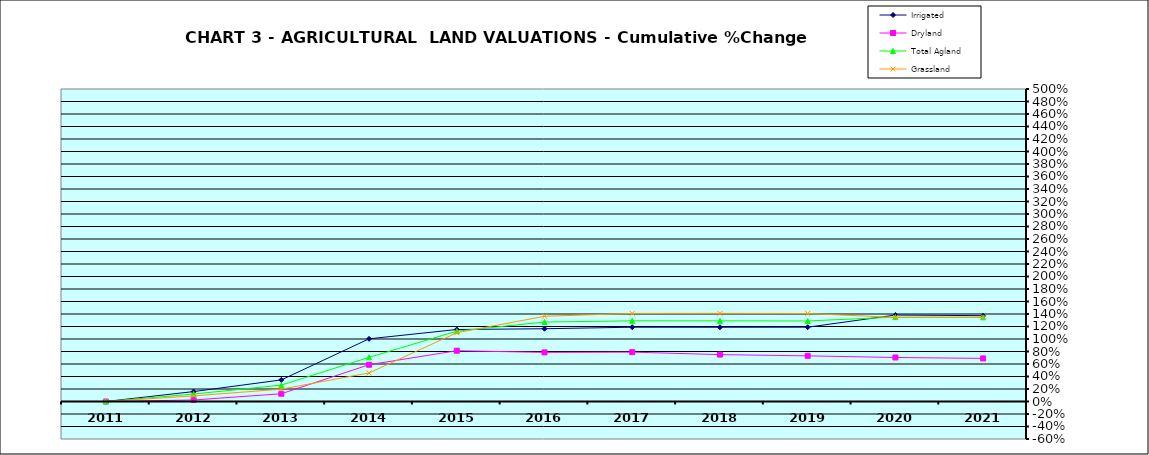
| Category | Irrigated | Dryland | Total Agland | Grassland |
|---|---|---|---|---|
| 2011.0 | 0 | 0 | 0 | 0 |
| 2012.0 | 0.159 | 0.024 | 0.119 | 0.09 |
| 2013.0 | 0.345 | 0.124 | 0.262 | 0.198 |
| 2014.0 | 1.003 | 0.588 | 0.706 | 0.457 |
| 2015.0 | 1.152 | 0.812 | 1.125 | 1.1 |
| 2016.0 | 1.164 | 0.786 | 1.271 | 1.363 |
| 2017.0 | 1.189 | 0.79 | 1.291 | 1.409 |
| 2018.0 | 1.188 | 0.75 | 1.29 | 1.41 |
| 2019.0 | 1.189 | 0.73 | 1.289 | 1.408 |
| 2020.0 | 1.383 | 0.704 | 1.35 | 1.345 |
| 2021.0 | 1.373 | 0.689 | 1.346 | 1.347 |